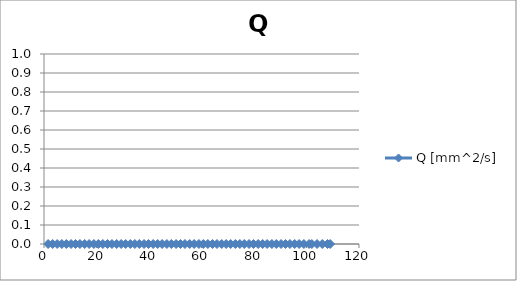
| Category | Q [mm^2/s] |
|---|---|
| 1.57 | 0 |
| 3.3 | 0 |
| 5.04 | 0 |
| 6.78 | 0 |
| 8.52 | 0 |
| 10.3 | 0 |
| 12.0 | 0 |
| 13.7 | 0 |
| 15.5 | 0 |
| 17.2 | 0 |
| 19.0 | 0 |
| 20.7 | 0 |
| 22.4 | 0 |
| 24.2 | 0 |
| 25.9 | 0 |
| 27.7 | 0 |
| 29.4 | 0 |
| 31.1 | 0 |
| 32.9 | 0 |
| 34.6 | 0 |
| 36.3 | 0 |
| 38.1 | 0 |
| 39.8 | 0 |
| 41.6 | 0 |
| 43.3 | 0 |
| 45.0 | 0 |
| 46.8 | 0 |
| 48.5 | 0 |
| 50.3 | 0 |
| 52.0 | 0 |
| 53.7 | 0 |
| 55.5 | 0 |
| 57.2 | 0 |
| 59.0 | 0 |
| 60.7 | 0 |
| 62.4 | 0 |
| 64.2 | 0 |
| 65.9 | 0 |
| 67.7 | 0 |
| 69.4 | 0 |
| 71.1 | 0 |
| 72.9 | 0 |
| 74.6 | 0 |
| 76.3 | 0 |
| 78.1 | 0 |
| 79.8 | 0 |
| 81.6 | 0 |
| 83.3 | 0 |
| 85.0 | 0 |
| 86.8 | 0 |
| 88.5 | 0 |
| 90.3 | 0 |
| 92.0 | 0 |
| 93.7 | 0 |
| 95.5 | 0 |
| 97.2 | 0 |
| 99.0 | 0 |
| 101.0 | 0 |
| 102.0 | 0 |
| 104.0 | 0 |
| 106.0 | 0 |
| 108.0 | 0 |
| 109.0 | 0 |